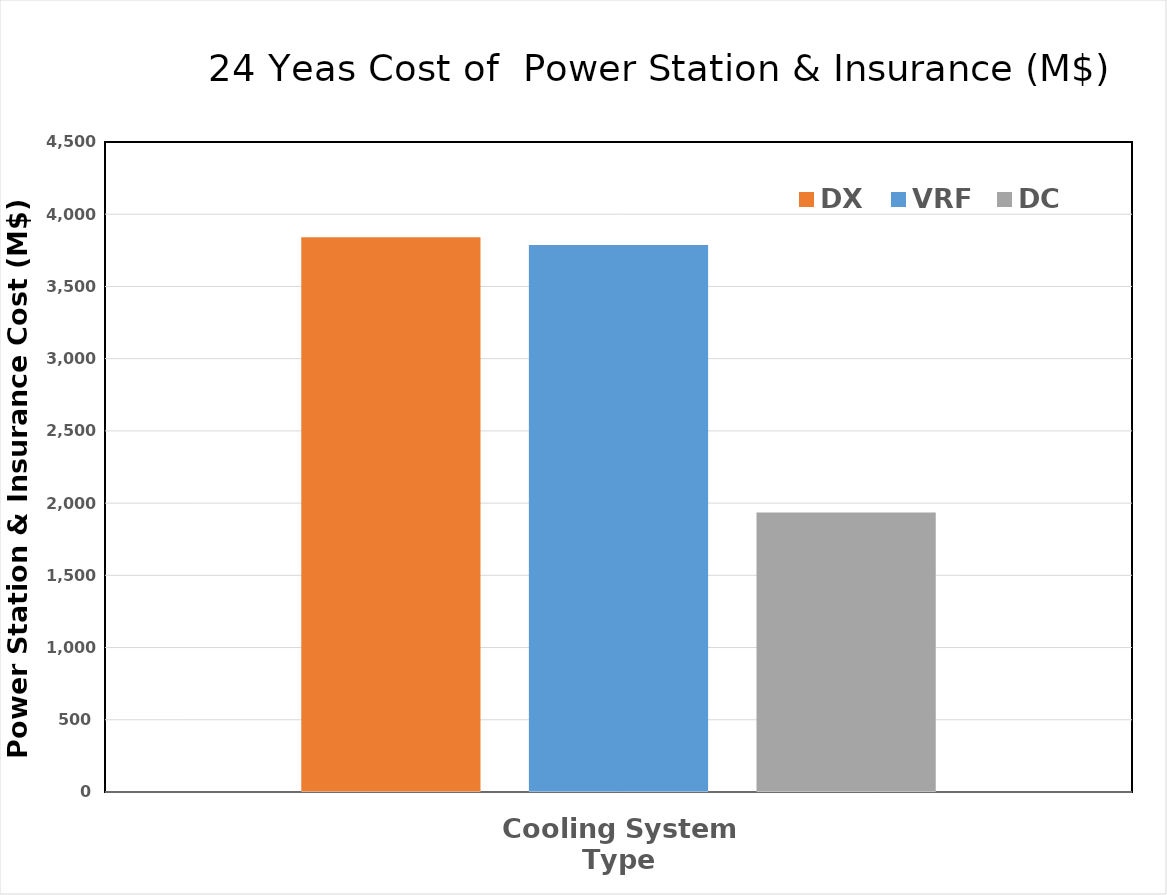
| Category | DX | VRF | DC |
|---|---|---|---|
| 0 | 3839.998 | 3787.682 | 1935.694 |